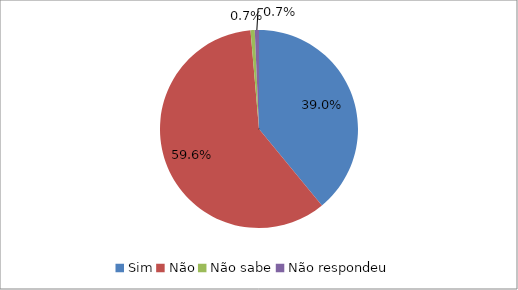
| Category | Series 0 |
|---|---|
| Sim | 0.39 |
| Não | 0.596 |
| Não sabe | 0.007 |
| Não respondeu | 0.007 |